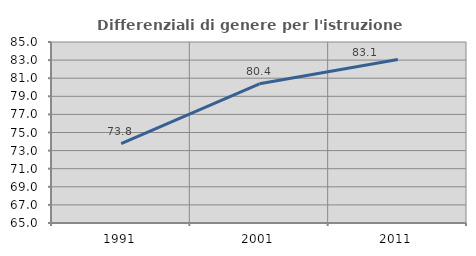
| Category | Differenziali di genere per l'istruzione superiore |
|---|---|
| 1991.0 | 73.774 |
| 2001.0 | 80.38 |
| 2011.0 | 83.064 |